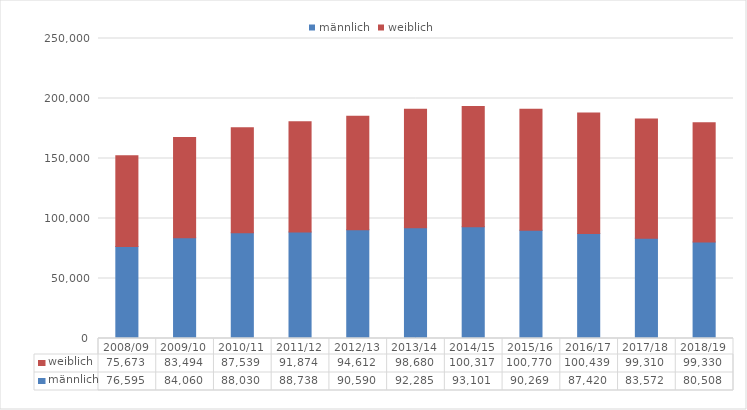
| Category | männlich | weiblich |
|---|---|---|
| 2008/09 | 76595 | 75673 |
| 2009/10 | 84060 | 83494 |
| 2010/11 | 88030 | 87539 |
| 2011/12 | 88738 | 91874 |
| 2012/13 | 90590 | 94612 |
| 2013/14 | 92285 | 98680 |
| 2014/15 | 93101 | 100317 |
| 2015/16 | 90269 | 100770 |
| 2016/17 | 87420 | 100439 |
| 2017/18 | 83572 | 99310 |
| 2018/19 | 80508 | 99330 |